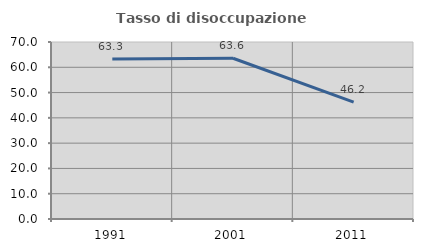
| Category | Tasso di disoccupazione giovanile  |
|---|---|
| 1991.0 | 63.317 |
| 2001.0 | 63.566 |
| 2011.0 | 46.226 |